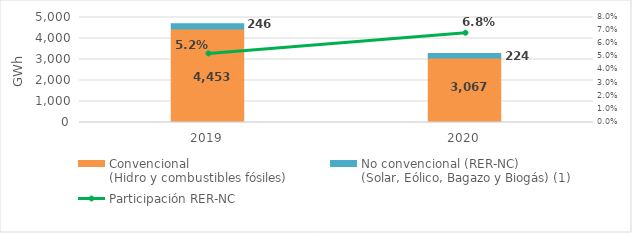
| Category | Convencional
(Hidro y combustibles fósiles) | No convencional (RER-NC)
(Solar, Eólico, Bagazo y Biogás) (1) |
|---|---|---|
| 2019.0 | 4452.914 | 245.532 |
| 2020.0 | 3067.094 | 223.813 |